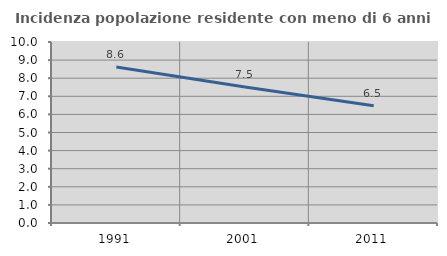
| Category | Incidenza popolazione residente con meno di 6 anni |
|---|---|
| 1991.0 | 8.621 |
| 2001.0 | 7.515 |
| 2011.0 | 6.478 |